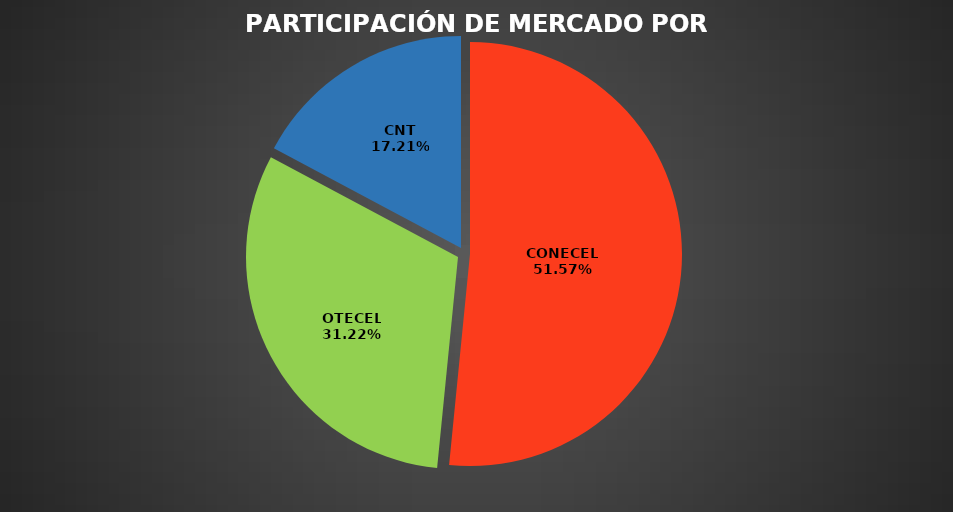
| Category | Jul 2022 |
|---|---|
| CONECEL | 8811432 |
| OTECEL | 5334228 |
| CNT | 2940353 |